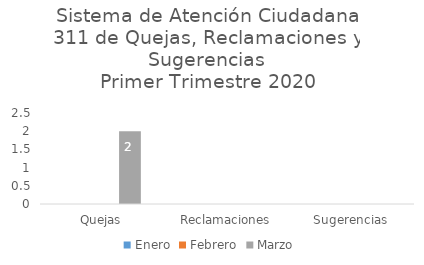
| Category | Enero | Febrero | Marzo |
|---|---|---|---|
| Quejas | 0 | 0 | 2 |
| Reclamaciones | 0 | 0 | 0 |
| Sugerencias | 0 | 0 | 0 |